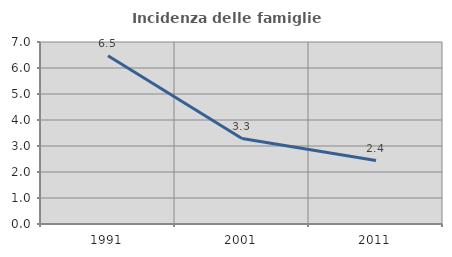
| Category | Incidenza delle famiglie numerose |
|---|---|
| 1991.0 | 6.469 |
| 2001.0 | 3.285 |
| 2011.0 | 2.442 |